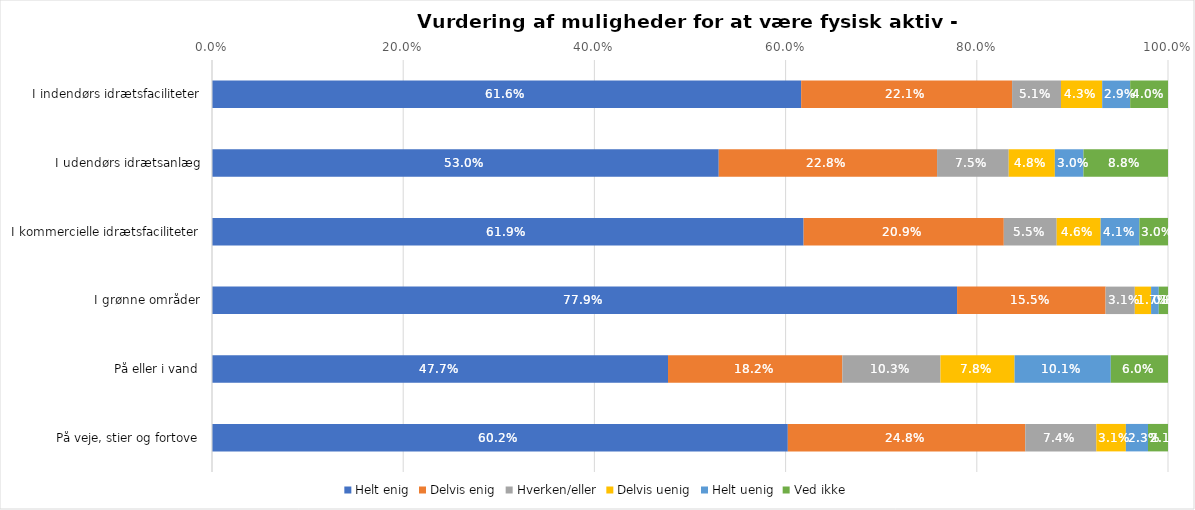
| Category | Helt enig | Delvis enig | Hverken/eller | Delvis uenig | Helt uenig | Ved ikke |
|---|---|---|---|---|---|---|
| I indendørs idrætsfaciliteter | 0.616 | 0.221 | 0.051 | 0.043 | 0.029 | 0.04 |
| I udendørs idrætsanlæg | 0.53 | 0.228 | 0.075 | 0.048 | 0.03 | 0.088 |
| I kommercielle idrætsfaciliteter | 0.619 | 0.209 | 0.055 | 0.046 | 0.041 | 0.03 |
| I grønne områder | 0.779 | 0.155 | 0.031 | 0.017 | 0.008 | 0.01 |
| På eller i vand | 0.477 | 0.182 | 0.103 | 0.078 | 0.101 | 0.06 |
| På veje, stier og fortove | 0.602 | 0.248 | 0.074 | 0.031 | 0.023 | 0.021 |